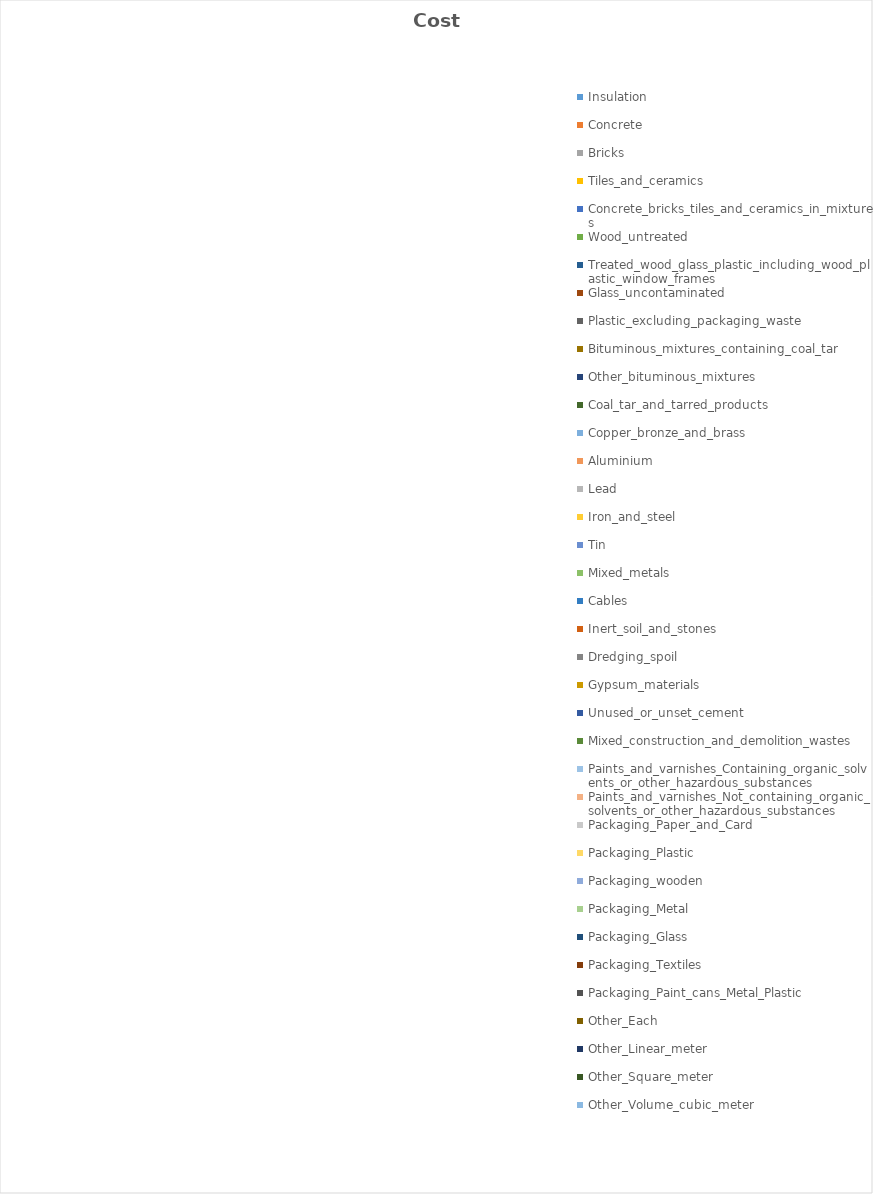
| Category | Cost |
|---|---|
| Insulation | 0 |
| Concrete | 0 |
| Bricks | 0 |
| Tiles_and_ceramics | 0 |
| Concrete_bricks_tiles_and_ceramics_in_mixtures | 0 |
| Wood_untreated | 0 |
| Treated_wood_glass_plastic_including_wood_plastic_window_frames | 0 |
| Glass_uncontaminated | 0 |
| Plastic_excluding_packaging_waste | 0 |
| Bituminous_mixtures_containing_coal_tar | 0 |
| Other_bituminous_mixtures | 0 |
| Coal_tar_and_tarred_products | 0 |
| Copper_bronze_and_brass | 0 |
| Aluminium | 0 |
| Lead | 0 |
| Iron_and_steel | 0 |
| Tin | 0 |
| Mixed_metals | 0 |
| Cables | 0 |
| Inert_soil_and_stones | 0 |
| Dredging_spoil | 0 |
| Gypsum_materials | 0 |
| Unused_or_unset_cement | 0 |
| Mixed_construction_and_demolition_wastes | 0 |
| Paints_and_varnishes_Containing_organic_solvents_or_other_hazardous_substances | 0 |
| Paints_and_varnishes_Not_containing_organic_solvents_or_other_hazardous_substances | 0 |
| Packaging_Paper_and_Card | 0 |
| Packaging_Plastic | 0 |
| Packaging_wooden | 0 |
| Packaging_Metal | 0 |
| Packaging_Glass | 0 |
| Packaging_Textiles | 0 |
| Packaging_Paint_cans_Metal_Plastic | 0 |
| Other_Each | 0 |
| Other_Linear_meter | 0 |
| Other_Square_meter | 0 |
| Other_Volume_cubic_meter | 0 |